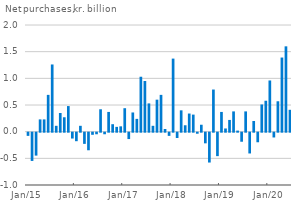
| Category | Series 0 |
|---|---|
| 42005.0 | -0.06 |
| 42036.0 | -0.53 |
| 42064.0 | -0.43 |
| 42095.0 | 0.23 |
| 42125.0 | 0.23 |
| 42156.0 | 0.69 |
| 42186.0 | 1.26 |
| 42217.0 | 0.11 |
| 42248.0 | 0.35 |
| 42278.0 | 0.27 |
| 42309.0 | 0.48 |
| 42339.0 | -0.11 |
| 42370.0 | -0.16 |
| 42401.0 | 0.11 |
| 42430.0 | -0.21 |
| 42461.0 | -0.33 |
| 42491.0 | -0.04 |
| 42522.0 | -0.03 |
| 42552.0 | 0.42 |
| 42583.0 | -0.03 |
| 42614.0 | 0.37 |
| 42644.0 | 0.14 |
| 42675.0 | 0.09 |
| 42705.0 | 0.1 |
| 42736.0 | 0.44 |
| 42767.0 | -0.12 |
| 42795.0 | 0.36 |
| 42826.0 | 0.24 |
| 42856.0 | 1.03 |
| 42887.0 | 0.95 |
| 42917.0 | 0.53 |
| 42948.0 | 0.11 |
| 42979.0 | 0.6 |
| 43009.0 | 0.69 |
| 43040.0 | 0.05 |
| 43070.0 | -0.06 |
| 43101.0 | 1.37 |
| 43132.0 | -0.1 |
| 43160.0 | 0.4 |
| 43191.0 | 0.12 |
| 43221.0 | 0.34 |
| 43252.0 | 0.32 |
| 43282.0 | -0.02 |
| 43313.0 | 0.13 |
| 43344.0 | -0.2 |
| 43374.0 | -0.56 |
| 43405.0 | 0.79 |
| 43435.0 | -0.44 |
| 43466.0 | 0.37 |
| 43497.0 | 0.06 |
| 43525.0 | 0.22 |
| 43556.0 | 0.38 |
| 43586.0 | 0.02 |
| 43617.0 | -0.17 |
| 43647.0 | 0.38 |
| 43678.0 | -0.39 |
| 43709.0 | 0.2 |
| 43739.0 | -0.18 |
| 43770.0 | 0.51 |
| 43800.0 | 0.58 |
| 43831.0 | 0.96 |
| 43862.0 | -0.09 |
| 43891.0 | 0.57 |
| 43922.0 | 1.39 |
| 43952.0 | 1.6 |
| 43983.0 | 0.41 |